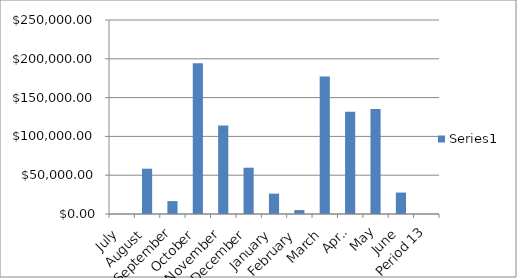
| Category | Series 0 |
|---|---|
| July | 0 |
| August | 58364.71 |
| September | 16634.145 |
| October | 194136.635 |
| November | 113967.76 |
| December | 59661.275 |
| January | 26241.72 |
| February | 5057.94 |
| March | 177082.9 |
| April | 131680.295 |
| May | 135275.25 |
| June | 27632.1 |
| Period 13 | 0 |